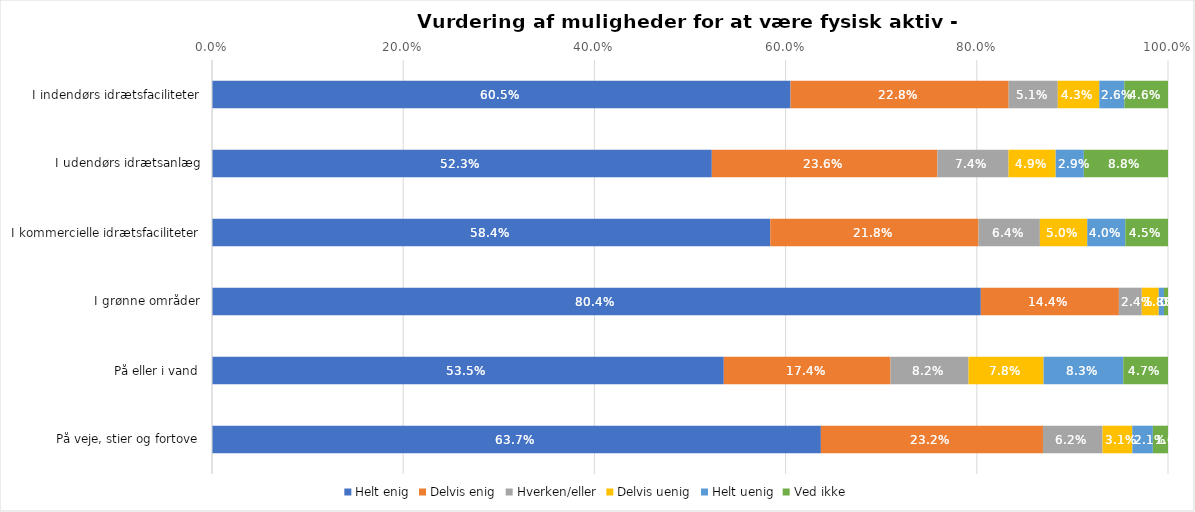
| Category | Helt enig | Delvis enig | Hverken/eller | Delvis uenig | Helt uenig | Ved ikke |
|---|---|---|---|---|---|---|
| I indendørs idrætsfaciliteter | 0.605 | 0.228 | 0.051 | 0.043 | 0.026 | 0.046 |
| I udendørs idrætsanlæg | 0.523 | 0.236 | 0.074 | 0.049 | 0.029 | 0.088 |
| I kommercielle idrætsfaciliteter | 0.584 | 0.218 | 0.064 | 0.05 | 0.04 | 0.045 |
| I grønne områder | 0.804 | 0.144 | 0.024 | 0.018 | 0.005 | 0.004 |
| På eller i vand | 0.535 | 0.174 | 0.082 | 0.078 | 0.083 | 0.047 |
| På veje, stier og fortove | 0.637 | 0.232 | 0.062 | 0.031 | 0.021 | 0.016 |